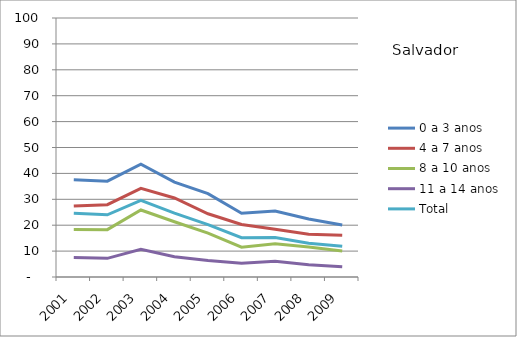
| Category | 0 a 3 anos | 4 a 7 anos | 8 a 10 anos | 11 a 14 anos | Total |
|---|---|---|---|---|---|
| 2001.0 | 37.52 | 27.39 | 18.35 | 7.53 | 24.63 |
| 2002.0 | 37.01 | 27.92 | 18.28 | 7.21 | 24.02 |
| 2003.0 | 43.53 | 34.21 | 25.87 | 10.73 | 29.56 |
| 2004.0 | 36.65 | 30.52 | 21.34 | 7.84 | 24.64 |
| 2005.0 | 32.16 | 24.41 | 16.94 | 6.37 | 20.25 |
| 2006.0 | 24.64 | 20.3 | 11.5 | 5.35 | 15.16 |
| 2007.0 | 25.48 | 18.41 | 12.83 | 6.04 | 15.26 |
| 2008.0 | 22.37 | 16.5 | 11.59 | 4.76 | 13 |
| 2009.0 | 20.11 | 16.09 | 10.04 | 3.93 | 11.84 |